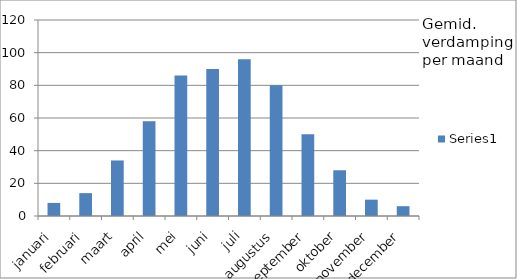
| Category | Series 0 |
|---|---|
| januari | 8 |
| februari | 14 |
| maart | 34 |
| april | 58 |
| mei | 86 |
| juni | 90 |
| juli | 96 |
| augustus | 80 |
| september | 50 |
| oktober | 28 |
| november | 10 |
| december | 6 |